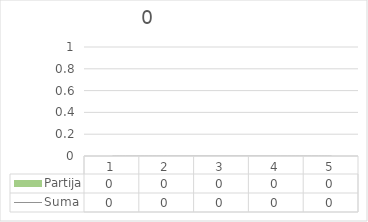
| Category | Partija |
|---|---|
| 0 | 0 |
| 1 | 0 |
| 2 | 0 |
| 3 | 0 |
| 4 | 0 |